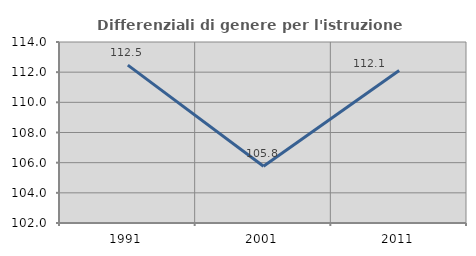
| Category | Differenziali di genere per l'istruzione superiore |
|---|---|
| 1991.0 | 112.47 |
| 2001.0 | 105.76 |
| 2011.0 | 112.104 |